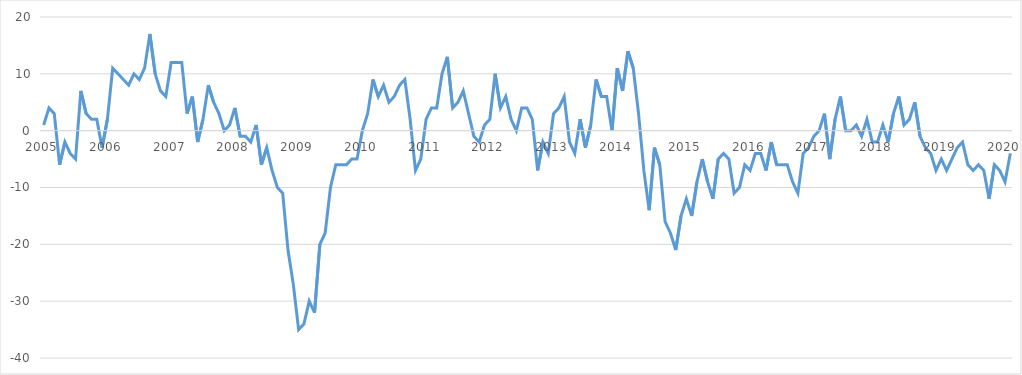
| Category | Sammensat konjunkturbarometer |
|---|---|
| 2005.0 | 1 |
| nan | 4 |
| nan | 3 |
| nan | -6 |
| nan | -2 |
| nan | -4 |
| nan | -5 |
| nan | 7 |
| nan | 3 |
| nan | 2 |
| nan | 2 |
| nan | -3 |
| 2006.0 | 2 |
| nan | 11 |
| nan | 10 |
| nan | 9 |
| nan | 8 |
| nan | 10 |
| nan | 9 |
| nan | 11 |
| nan | 17 |
| nan | 10 |
| nan | 7 |
| nan | 6 |
| 2007.0 | 12 |
| nan | 12 |
| nan | 12 |
| nan | 3 |
| nan | 6 |
| nan | -2 |
| nan | 2 |
| nan | 8 |
| nan | 5 |
| nan | 3 |
| nan | 0 |
| nan | 1 |
| 2008.0 | 4 |
| nan | -1 |
| nan | -1 |
| nan | -2 |
| nan | 1 |
| nan | -6 |
| nan | -3 |
| nan | -7 |
| nan | -10 |
| nan | -11 |
| nan | -21 |
| nan | -27 |
| 2009.0 | -35 |
| nan | -34 |
| nan | -30 |
| nan | -32 |
| nan | -20 |
| nan | -18 |
| nan | -10 |
| nan | -6 |
| nan | -6 |
| nan | -6 |
| nan | -5 |
| nan | -5 |
| 2010.0 | 0 |
| nan | 3 |
| nan | 9 |
| nan | 6 |
| nan | 8 |
| nan | 5 |
| nan | 6 |
| nan | 8 |
| nan | 9 |
| nan | 2 |
| nan | -7 |
| nan | -5 |
| 2011.0 | 2 |
| nan | 4 |
| nan | 4 |
| nan | 10 |
| nan | 13 |
| nan | 4 |
| nan | 5 |
| nan | 7 |
| nan | 3 |
| nan | -1 |
| nan | -2 |
| nan | 1 |
| 2012.0 | 2 |
| nan | 10 |
| nan | 4 |
| nan | 6 |
| nan | 2 |
| nan | 0 |
| nan | 4 |
| nan | 4 |
| nan | 2 |
| nan | -7 |
| nan | -2 |
| nan | -4 |
| 2013.0 | 3 |
| nan | 4 |
| nan | 6 |
| nan | -2 |
| nan | -4 |
| nan | 2 |
| nan | -3 |
| nan | 1 |
| nan | 9 |
| nan | 6 |
| nan | 6 |
| nan | 0 |
| 2014.0 | 11 |
| nan | 7 |
| nan | 14 |
| nan | 11 |
| nan | 3 |
| nan | -7 |
| nan | -14 |
| nan | -3 |
| nan | -6 |
| nan | -16 |
| nan | -18 |
| nan | -21 |
| nan | -15 |
| 2015.0 | -12 |
| nan | -15 |
| nan | -9 |
| nan | -5 |
| nan | -9 |
| nan | -12 |
| nan | -5 |
| nan | -4 |
| nan | -5 |
| nan | -11 |
| nan | -10 |
| nan | -6 |
| 2016.0 | -7 |
| nan | -4 |
| nan | -4 |
| nan | -7 |
| nan | -2 |
| nan | -6 |
| nan | -6 |
| nan | -6 |
| nan | -9 |
| nan | -11 |
| nan | -4 |
| nan | -3 |
| 2017.0 | -1 |
| nan | 0 |
| nan | 3 |
| nan | -5 |
| nan | 2 |
| nan | 6 |
| nan | 0 |
| nan | 0 |
| nan | 1 |
| nan | -1 |
| nan | 2 |
| nan | -2 |
| 2018.0 | -2 |
| nan | 1 |
| nan | -2 |
| nan | 3 |
| nan | 6 |
| nan | 1 |
| nan | 2 |
| nan | 5 |
| nan | -1 |
| nan | -3 |
| nan | -4 |
| nan | -7 |
| 2019.0 | -5 |
| nan | -7 |
| nan | -5 |
| nan | -3 |
| nan | -2 |
| nan | -6 |
| nan | -7 |
| nan | -6 |
| nan | -7 |
| nan | -12 |
| nan | -6 |
| nan | -7 |
| 2020.0 | -9 |
| nan | -4 |